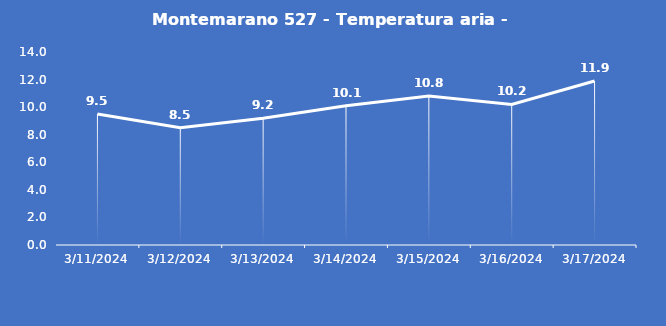
| Category | Montemarano 527 - Temperatura aria - Grezzo (°C) |
|---|---|
| 3/11/24 | 9.5 |
| 3/12/24 | 8.5 |
| 3/13/24 | 9.2 |
| 3/14/24 | 10.1 |
| 3/15/24 | 10.8 |
| 3/16/24 | 10.2 |
| 3/17/24 | 11.9 |